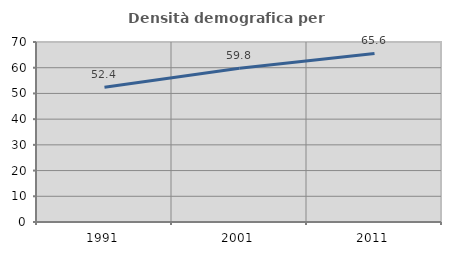
| Category | Densità demografica |
|---|---|
| 1991.0 | 52.398 |
| 2001.0 | 59.782 |
| 2011.0 | 65.564 |